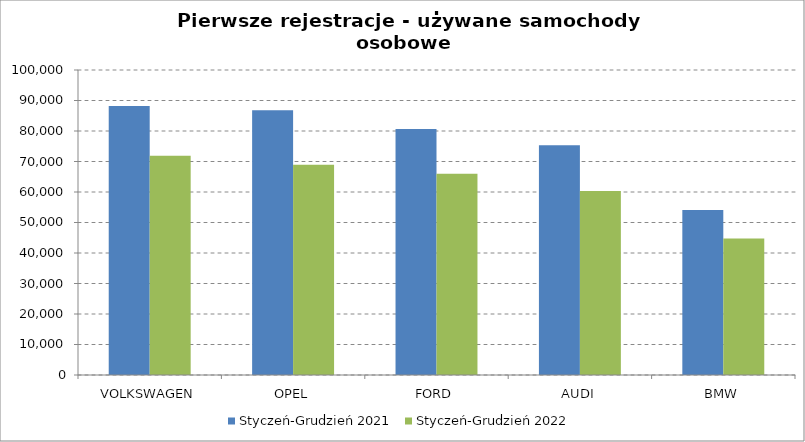
| Category | Styczeń-Grudzień 2021 | Styczeń-Grudzień 2022 |
|---|---|---|
| VOLKSWAGEN | 88195 | 71862 |
| OPEL | 86839 | 68912 |
| FORD | 80652 | 65961 |
| AUDI | 75336 | 60314 |
| BMW | 54136 | 44789 |